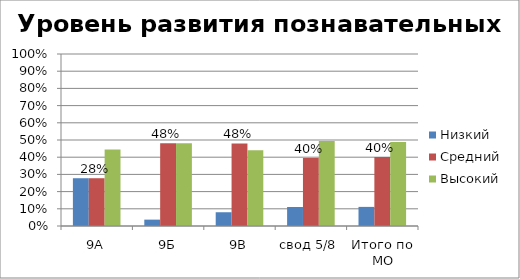
| Category | Низкий | Средний | Высокий |
|---|---|---|---|
| 9А | 0.278 | 0.278 | 0.444 |
| 9Б | 0.037 | 0.481 | 0.481 |
| 9В | 0.08 | 0.48 | 0.44 |
| свод 5/8 | 0.11 | 0.395 | 0.494 |
| Итого по МО | 0.111 | 0.401 | 0.488 |